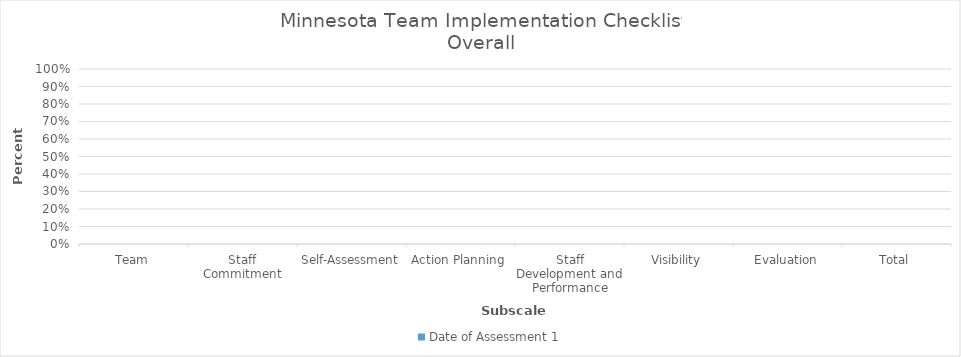
| Category | Date of Assessment 1 |
|---|---|
| Team | 0 |
| Staff Commitment | 0 |
| Self-Assessment | 0 |
| Action Planning | 0 |
| Staff Development and Performance | 0 |
| Visibility | 0 |
| Evaluation | 0 |
| Total | 0 |